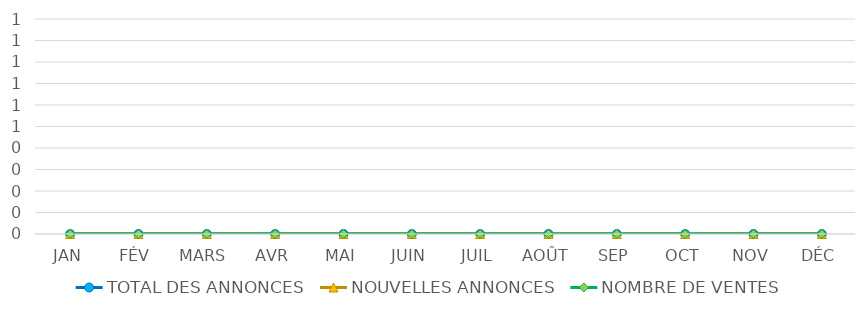
| Category | TOTAL DES ANNONCES | NOUVELLES ANNONCES | NOMBRE DE VENTES |
|---|---|---|---|
| JAN | 0 | 0 | 0 |
| FÉV | 0 | 0 | 0 |
| MARS | 0 | 0 | 0 |
| AVR | 0 | 0 | 0 |
| MAI | 0 | 0 | 0 |
| JUIN | 0 | 0 | 0 |
| JUIL | 0 | 0 | 0 |
| AOÛT | 0 | 0 | 0 |
| SEP | 0 | 0 | 0 |
| OCT | 0 | 0 | 0 |
| NOV | 0 | 0 | 0 |
| DÉC | 0 | 0 | 0 |